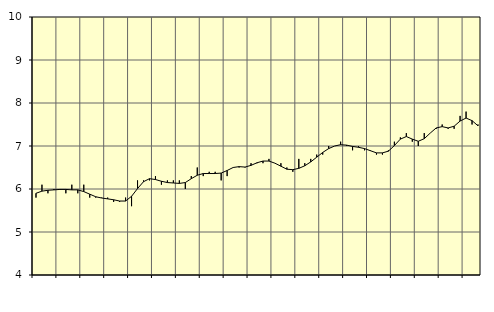
| Category | Piggar | Personliga och kulturella tjänster, SNI 90-98 |
|---|---|---|
| nan | 5.8 | 5.9 |
| 1.0 | 6.1 | 5.95 |
| 1.0 | 5.9 | 5.97 |
| 1.0 | 6 | 5.98 |
| nan | 6 | 5.99 |
| 2.0 | 5.9 | 5.99 |
| 2.0 | 6.1 | 5.98 |
| 2.0 | 5.9 | 5.98 |
| nan | 6.1 | 5.94 |
| 3.0 | 5.8 | 5.88 |
| 3.0 | 5.8 | 5.82 |
| 3.0 | 5.8 | 5.79 |
| nan | 5.8 | 5.77 |
| 4.0 | 5.7 | 5.75 |
| 4.0 | 5.7 | 5.72 |
| 4.0 | 5.8 | 5.72 |
| nan | 5.6 | 5.83 |
| 5.0 | 6.2 | 6.01 |
| 5.0 | 6.2 | 6.17 |
| 5.0 | 6.2 | 6.24 |
| nan | 6.3 | 6.22 |
| 6.0 | 6.1 | 6.18 |
| 6.0 | 6.2 | 6.15 |
| 6.0 | 6.2 | 6.14 |
| nan | 6.2 | 6.13 |
| 7.0 | 6 | 6.15 |
| 7.0 | 6.3 | 6.24 |
| 7.0 | 6.5 | 6.32 |
| nan | 6.3 | 6.36 |
| 8.0 | 6.4 | 6.36 |
| 8.0 | 6.4 | 6.36 |
| 8.0 | 6.2 | 6.37 |
| nan | 6.3 | 6.43 |
| 9.0 | 6.5 | 6.5 |
| 9.0 | 6.5 | 6.52 |
| 9.0 | 6.5 | 6.51 |
| nan | 6.6 | 6.55 |
| 10.0 | 6.6 | 6.61 |
| 10.0 | 6.6 | 6.65 |
| 10.0 | 6.7 | 6.65 |
| nan | 6.6 | 6.6 |
| 11.0 | 6.6 | 6.53 |
| 11.0 | 6.5 | 6.46 |
| 11.0 | 6.4 | 6.45 |
| nan | 6.7 | 6.48 |
| 12.0 | 6.6 | 6.54 |
| 12.0 | 6.7 | 6.63 |
| 12.0 | 6.8 | 6.74 |
| nan | 6.8 | 6.85 |
| 13.0 | 7 | 6.94 |
| 13.0 | 7 | 7 |
| 13.0 | 7.1 | 7.03 |
| nan | 7 | 7.02 |
| 14.0 | 6.9 | 6.99 |
| 14.0 | 7 | 6.97 |
| 14.0 | 6.9 | 6.94 |
| nan | 6.9 | 6.89 |
| 15.0 | 6.8 | 6.84 |
| 15.0 | 6.8 | 6.84 |
| 15.0 | 6.9 | 6.88 |
| nan | 7.1 | 7.01 |
| 16.0 | 7.2 | 7.16 |
| 16.0 | 7.3 | 7.22 |
| 16.0 | 7.1 | 7.16 |
| nan | 7 | 7.11 |
| 17.0 | 7.3 | 7.17 |
| 17.0 | 7.3 | 7.3 |
| 17.0 | 7.4 | 7.42 |
| nan | 7.5 | 7.45 |
| 18.0 | 7.4 | 7.42 |
| 18.0 | 7.4 | 7.46 |
| 18.0 | 7.7 | 7.58 |
| nan | 7.8 | 7.65 |
| 19.0 | 7.5 | 7.59 |
| 19.0 | 7.5 | 7.47 |